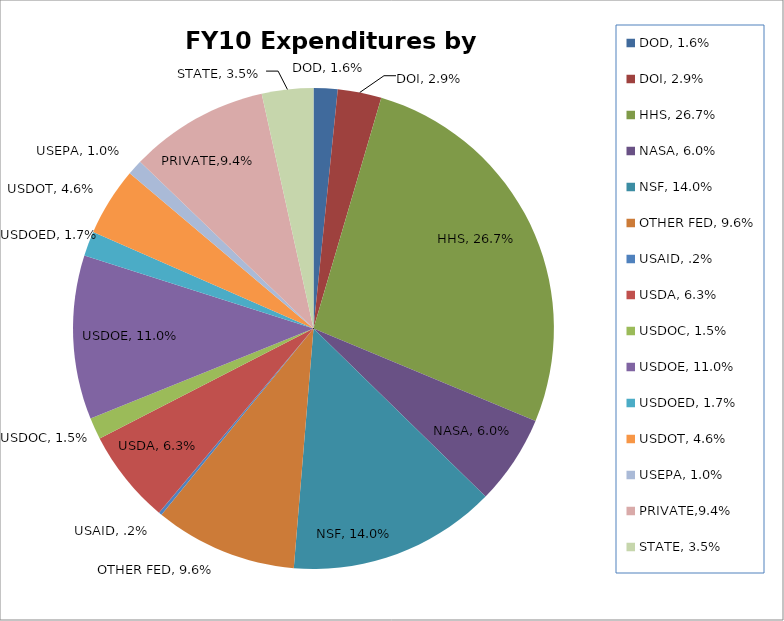
| Category | FY10 Exp. |
|---|---|
| DOD, 1.6% | 1763136.31 |
| DOI, 2.9% | 3216774.42 |
| HHS, 26.7% | 29267993.52 |
| NASA, 6.0% | 6601338.32 |
| NSF, 14.0% | 15323038.27 |
| OTHER FED, 9.6% | 10494884.55 |
| USAID, .2% | 230023.36 |
| USDA, 6.3% | 6933162.7 |
| USDOC, 1.5% | 1589575.28 |
| USDOE, 11.0% | 12068405.53 |
| USDOED, 1.7% | 1813774.69 |
| USDOT, 4.6% | 5026932.24 |
| USEPA, 1.0% | 1120597.64 |
| PRIVATE,9.4% | 10247252.38 |
| STATE, 3.5% | 3784804.83 |